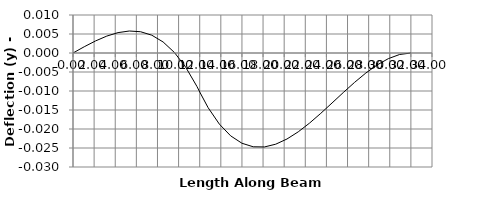
| Category | y |
|---|---|
| 0.0 | 0 |
| 0.0 | 0 |
| 1.0666666666666667 | 0.002 |
| 2.1333333333333333 | 0.003 |
| 3.2 | 0.004 |
| 4.266666666666667 | 0.005 |
| 5.333333333333333 | 0.006 |
| 6.4 | 0.006 |
| 7.466666666666667 | 0.005 |
| 8.533333333333333 | 0.003 |
| 9.6 | 0 |
| 10.666666666666666 | -0.004 |
| 11.733333333333333 | -0.009 |
| 11.99999 | -0.01 |
| 12.00001 | -0.01 |
| 12.8 | -0.014 |
| 13.866666666666667 | -0.019 |
| 14.933333333333334 | -0.022 |
| 16.0 | -0.024 |
| 17.066666666666666 | -0.025 |
| 18.133333333333333 | -0.025 |
| 19.2 | -0.024 |
| 20.266666666666666 | -0.023 |
| 21.333333333333332 | -0.021 |
| 22.4 | -0.018 |
| 23.466666666666665 | -0.016 |
| 24.53333333333333 | -0.013 |
| 25.6 | -0.01 |
| 26.666666666666668 | -0.008 |
| 27.733333333333334 | -0.005 |
| 28.8 | -0.003 |
| 29.866666666666667 | -0.001 |
| 30.933333333333334 | 0 |
| 32.0 | 0 |